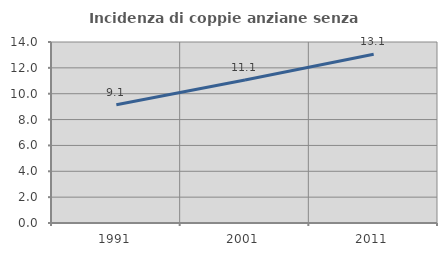
| Category | Incidenza di coppie anziane senza figli  |
|---|---|
| 1991.0 | 9.147 |
| 2001.0 | 11.062 |
| 2011.0 | 13.056 |